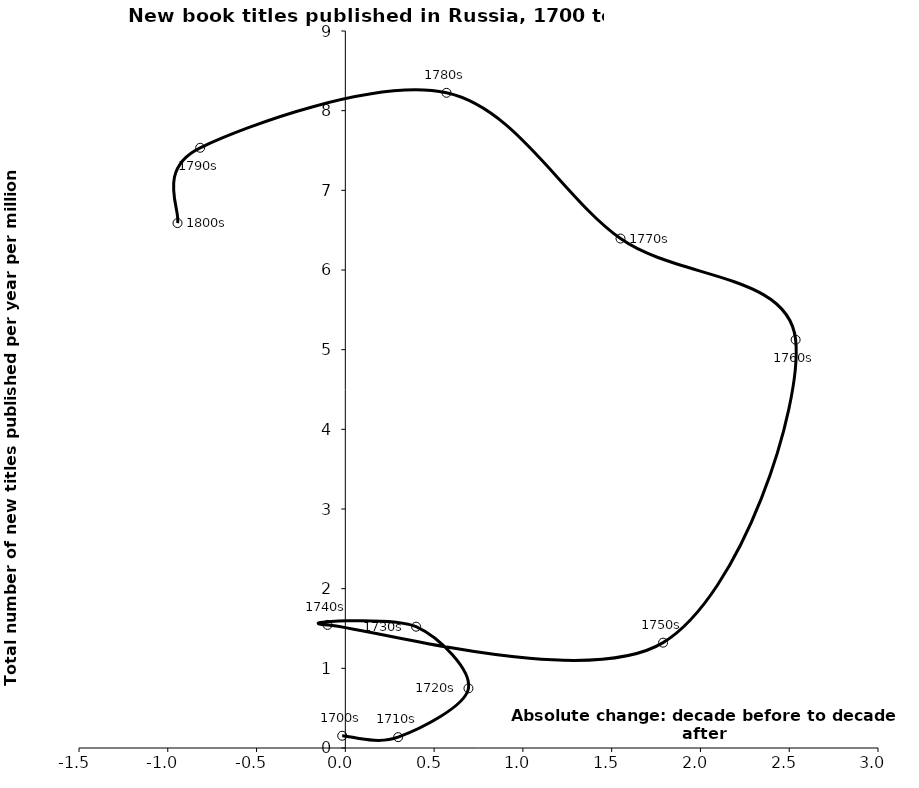
| Category | Series 0 |
|---|---|
| -0.017619844498374476 | 0.154 |
| 0.29741442145490693 | 0.136 |
| 0.693461973665212 | 0.748 |
| 0.39843854781461574 | 1.523 |
| -0.10021859264213795 | 1.545 |
| 1.789587004838992 | 1.322 |
| 2.536142951126523 | 5.124 |
| 1.549845483136115 | 6.395 |
| 0.5697315127578402 | 8.224 |
| -0.817545613887082 | 7.534 |
| -0.9451361586014047 | 6.589 |